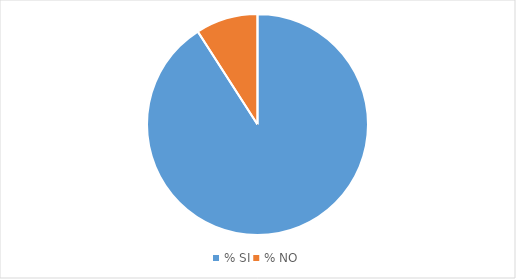
| Category | Series 0 | Series 1 | Series 2 | Series 3 | Series 4 | Series 5 | Series 6 | Series 7 |
|---|---|---|---|---|---|---|---|---|
| % SI | 13.699 | 13.699 | 10.959 | 8.219 | 10.959 | 14.384 | 12.329 | 9.589 |
| % NO | 1.37 | 0 | 0.685 | 1.37 | 1.37 | 0.685 | 0 | 0.685 |